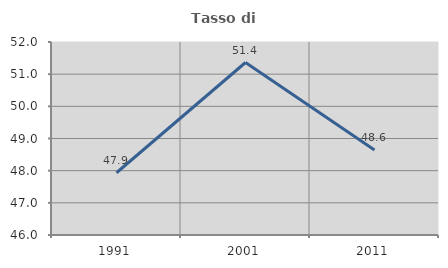
| Category | Tasso di occupazione   |
|---|---|
| 1991.0 | 47.936 |
| 2001.0 | 51.363 |
| 2011.0 | 48.639 |